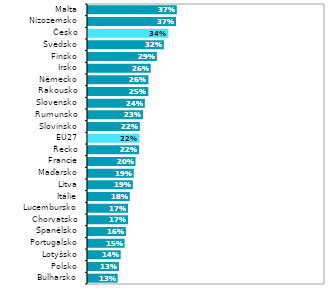
| Category | Series 1 |
|---|---|
| Bulharsko | 0.125 |
| Polsko | 0.13 |
| Lotyšsko | 0.138 |
| Portugalsko | 0.154 |
| Španělsko | 0.16 |
| Chorvatsko | 0.169 |
| Lucembursko | 0.169 |
| Itálie | 0.176 |
| Litva | 0.189 |
| Maďarsko | 0.193 |
| Francie | 0.2 |
| Řecko | 0.215 |
| EU27 | 0.217 |
| Slovinsko | 0.219 |
| Rumunsko | 0.232 |
| Slovensko | 0.24 |
| Rakousko | 0.254 |
| Německo | 0.255 |
| Irsko | 0.265 |
| Finsko | 0.29 |
| Švédsko | 0.32 |
| Česko | 0.339 |
| Nizozemsko | 0.371 |
| Malta | 0.375 |